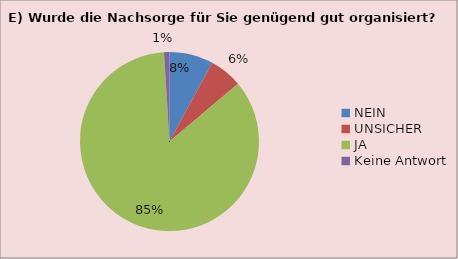
| Category | 12E | 13E | 14E | 15E |
|---|---|---|---|---|
| NEIN | 8 | 8 | 33 | 12 |
| UNSICHER | 6 | 5 | 0 | 0 |
| JA | 86 | 83 | 38 | 82 |
| Keine Antwort | 1 | 5 | 8 | 7 |